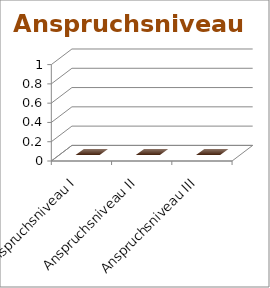
| Category | Series 0 |
|---|---|
| Anspruchsniveau I | 0 |
| Anspruchsniveau II | 0 |
| Anspruchsniveau III | 0 |